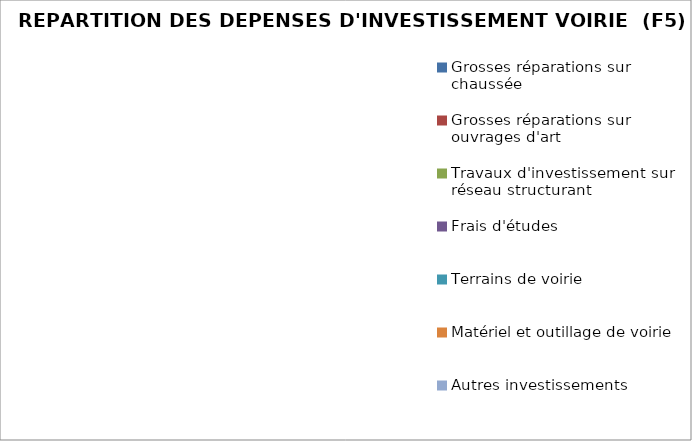
| Category | Series 0 |
|---|---|
| Grosses réparations sur chaussée | 0 |
| Grosses réparations sur ouvrages d'art | 0 |
| Travaux d'investissement sur réseau structurant | 0 |
| Frais d'études | 0 |
| Terrains de voirie | 0 |
| Matériel et outillage de voirie | 0 |
| Autres investissements | 0 |